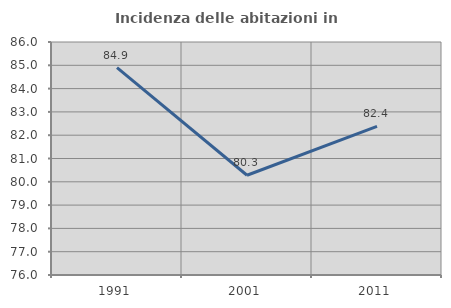
| Category | Incidenza delle abitazioni in proprietà  |
|---|---|
| 1991.0 | 84.899 |
| 2001.0 | 80.282 |
| 2011.0 | 82.382 |